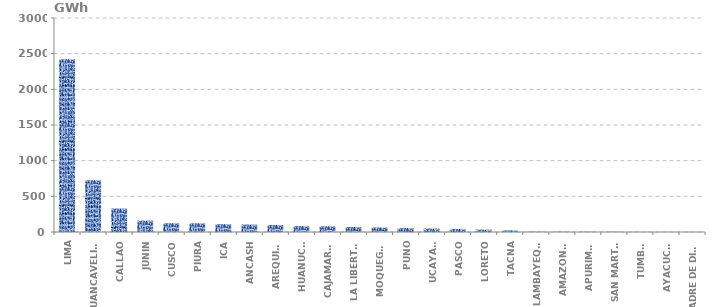
| Category | Series 0 |
|---|---|
| LIMA | 2423.054 |
| HUANCAVELICA | 725.993 |
| CALLAO | 328.885 |
| JUNIN | 159.213 |
| CUSCO | 122.805 |
| PIURA | 121.81 |
| ICA | 109.378 |
| ANCASH | 104.309 |
| AREQUIPA | 98.182 |
| HUANUCO | 82.862 |
| CAJAMARCA | 80.314 |
| LA LIBERTAD | 70.172 |
| MOQUEGUA | 63.303 |
| PUNO | 55.493 |
| UCAYALI | 48.738 |
| PASCO | 42.53 |
| LORETO | 33.527 |
| TACNA | 22.758 |
| LAMBAYEQUE | 4.683 |
| AMAZONAS | 4.126 |
| APURIMAC | 3.214 |
| SAN MARTÍN | 2.974 |
| TUMBES | 1.101 |
| AYACUCHO | 0.611 |
| MADRE DE DIOS | 0.107 |